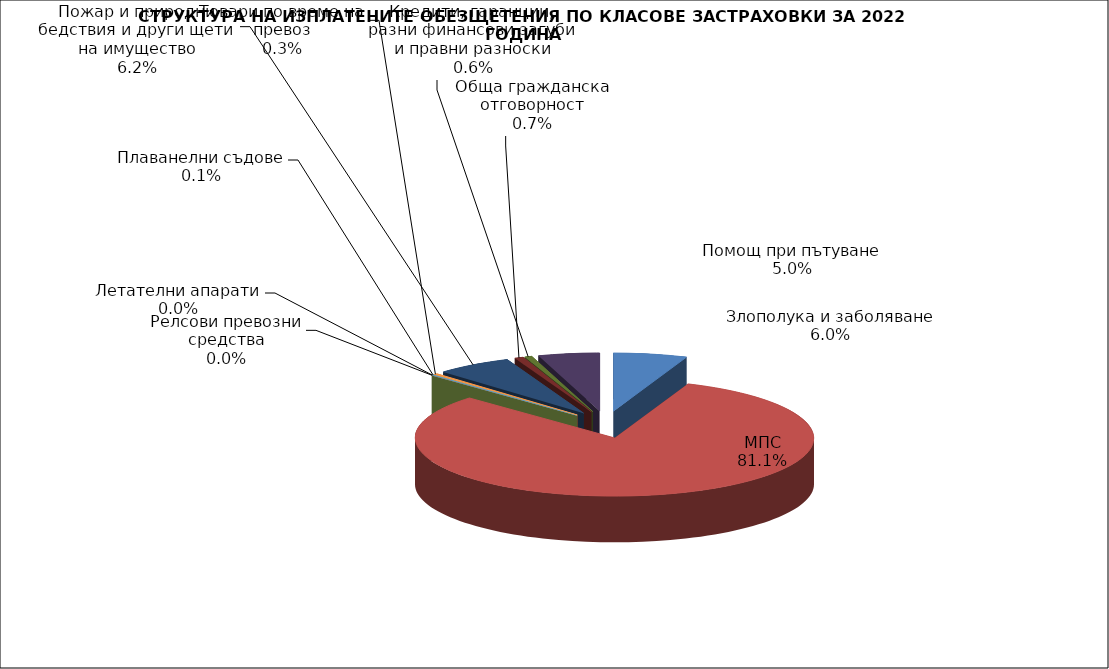
| Category | Злополука и заболяване |
|---|---|
| Злополука и заболяване | 0.06 |
| МПС | 0.811 |
| Релсови превозни средства | 0 |
| Летателни апарати | 0 |
| Плаванелни съдове | 0.001 |
| Товари по време на превоз | 0.003 |
| Пожар и природни бедствия и други щети на имущество | 0.062 |
| Обща гражданска отговорност | 0.007 |
| Кредити, гаранции, разни финансови загуби и правни разноски | 0.006 |
| Помощ при пътуване | 0.05 |